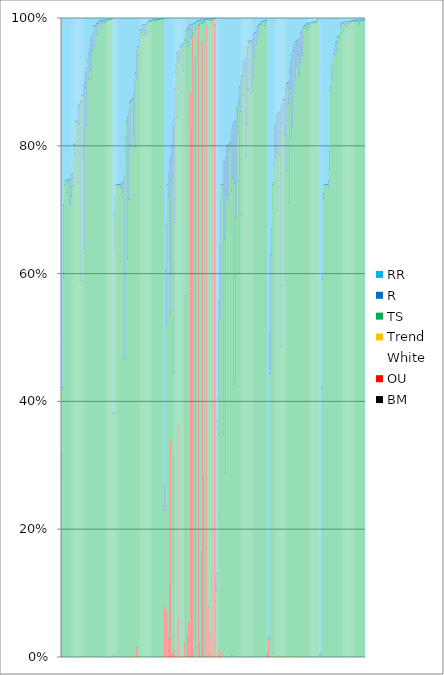
| Category | BM | OU | White | Trend | TS | R | RR |
|---|---|---|---|---|---|---|---|
| 0 | 0 | 0.199 | 0 | 0 | 0.084 | 0.036 | 0.681 |
| 1 | 0 | 0 | 0 | 0 | 0.422 | 0.001 | 0.577 |
| 2 | 0 | 0 | 0 | 0 | 0.594 | 0.114 | 0.291 |
| 3 | 0 | 0 | 0 | 0 | 0.74 | 0 | 0.26 |
| 4 | 0 | 0 | 0 | 0 | 0.744 | 0.002 | 0.254 |
| 5 | 0 | 0 | 0 | 0 | 0.748 | 0 | 0.252 |
| 6 | 0 | 0 | 0 | 0 | 0.727 | 0.021 | 0.252 |
| 7 | 0 | 0 | 0 | 0 | 0.746 | 0.002 | 0.252 |
| 8 | 0 | 0 | 0 | 0 | 0.712 | 0.037 | 0.252 |
| 9 | 0 | 0 | 0 | 0 | 0.709 | 0.041 | 0.25 |
| 10 | 0 | 0 | 0 | 0 | 0.721 | 0.035 | 0.243 |
| 11 | 0 | 0 | 0 | 0 | 0.738 | 0.02 | 0.243 |
| 12 | 0 | 0 | 0 | 0 | 0.803 | 0.001 | 0.196 |
| 13 | 0 | 0 | 0 | 0 | 0.785 | 0.019 | 0.196 |
| 14 | 0 | 0 | 0 | 0 | 0.839 | 0 | 0.161 |
| 15 | 0 | 0 | 0 | 0 | 0.84 | 0 | 0.16 |
| 16 | 0 | 0 | 0 | 0 | 0.744 | 0.12 | 0.136 |
| 17 | 0 | 0 | 0 | 0 | 0.834 | 0.031 | 0.135 |
| 18 | 0 | 0 | 0 | 0 | 0.59 | 0.279 | 0.13 |
| 19 | 0 | 0 | 0 | 0 | 0.87 | 0 | 0.13 |
| 20 | 0 | 0 | 0 | 0 | 0.88 | 0 | 0.12 |
| 21 | 0 | 0 | 0 | 0 | 0.782 | 0.114 | 0.104 |
| 22 | 0 | 0 | 0 | 0 | 0.64 | 0.26 | 0.1 |
| 23 | 0 | 0 | 0 | 0 | 0.891 | 0.025 | 0.084 |
| 24 | 0 | 0.001 | 0 | 0 | 0.832 | 0.089 | 0.078 |
| 25 | 0 | 0 | 0 | 0 | 0.934 | 0 | 0.066 |
| 26 | 0 | 0 | 0 | 0 | 0.905 | 0.041 | 0.054 |
| 27 | 0 | 0 | 0 | 0 | 0.95 | 0.003 | 0.048 |
| 28 | 0 | 0.001 | 0 | 0 | 0.919 | 0.046 | 0.034 |
| 29 | 0 | 0 | 0 | 0 | 0.906 | 0.066 | 0.027 |
| 30 | 0 | 0 | 0 | 0 | 0.949 | 0.028 | 0.023 |
| 31 | 0 | 0 | 0 | 0 | 0.988 | 0 | 0.012 |
| 32 | 0 | 0 | 0 | 0 | 0.957 | 0.032 | 0.011 |
| 33 | 0 | 0 | 0 | 0 | 0.989 | 0 | 0.011 |
| 34 | 0 | 0 | 0 | 0 | 0.975 | 0.018 | 0.008 |
| 35 | 0 | 0 | 0 | 0 | 0.992 | 0.001 | 0.008 |
| 36 | 0 | 0 | 0 | 0 | 0.992 | 0.003 | 0.005 |
| 37 | 0 | 0 | 0 | 0 | 0.996 | 0 | 0.004 |
| 38 | 0 | 0 | 0 | 0 | 0.987 | 0.009 | 0.004 |
| 39 | 0 | 0 | 0 | 0 | 0.996 | 0.001 | 0.003 |
| 40 | 0 | 0 | 0 | 0 | 0.993 | 0.004 | 0.003 |
| 41 | 0 | 0 | 0 | 0 | 0.997 | 0 | 0.003 |
| 42 | 0 | 0 | 0 | 0 | 0.995 | 0.002 | 0.002 |
| 43 | 0 | 0 | 0 | 0 | 0.994 | 0.004 | 0.002 |
| 44 | 0 | 0 | 0 | 0 | 0.997 | 0.001 | 0.002 |
| 45 | 0 | 0 | 0 | 0 | 0.998 | 0 | 0.002 |
| 46 | 0 | 0 | 0 | 0 | 0.999 | 0 | 0.001 |
| 47 | 0 | 0 | 0 | 0 | 0.999 | 0 | 0.001 |
| 48 | 0 | 0 | 0 | 0 | 0.999 | 0 | 0.001 |
| 49 | 0 | 0 | 0 | 0 | 0.999 | 0 | 0.001 |
| 50 | 0 | 0.004 | 0 | 0 | 0.378 | 0 | 0.618 |
| 51 | 0 | 0 | 0 | 0 | 0.693 | 0 | 0.307 |
| 52 | 0 | 0 | 0 | 0 | 0.638 | 0.084 | 0.278 |
| 53 | 0 | 0 | 0 | 0 | 0.74 | 0 | 0.26 |
| 54 | 0 | 0 | 0 | 0 | 0.74 | 0 | 0.26 |
| 55 | 0 | 0 | 0 | 0 | 0.74 | 0 | 0.26 |
| 56 | 0 | 0 | 0 | 0 | 0.74 | 0 | 0.26 |
| 57 | 0 | 0 | 0 | 0 | 0.74 | 0.001 | 0.26 |
| 58 | 0 | 0 | 0 | 0 | 0.735 | 0.008 | 0.257 |
| 59 | 0 | 0 | 0 | 0 | 0.728 | 0.015 | 0.257 |
| 60 | 0 | 0 | 0 | 0 | 0.743 | 0 | 0.257 |
| 61 | 0 | 0.001 | 0 | 0 | 0.467 | 0.285 | 0.247 |
| 62 | 0 | 0 | 0 | 0 | 0.791 | 0.024 | 0.185 |
| 63 | 0 | 0 | 0 | 0 | 0.837 | 0.001 | 0.161 |
| 64 | 0 | 0 | 0 | 0 | 0.625 | 0.222 | 0.153 |
| 65 | 0 | 0 | 0 | 0 | 0.716 | 0.138 | 0.145 |
| 66 | 0 | 0 | 0 | 0 | 0.867 | 0.003 | 0.13 |
| 67 | 0 | 0 | 0 | 0 | 0.802 | 0.07 | 0.127 |
| 68 | 0 | 0 | 0 | 0 | 0.87 | 0.003 | 0.127 |
| 69 | 0 | 0 | 0 | 0 | 0.873 | 0.002 | 0.125 |
| 70 | 0 | 0 | 0 | 0 | 0.819 | 0.063 | 0.118 |
| 71 | 0 | 0.002 | 0 | 0 | 0.797 | 0.102 | 0.099 |
| 72 | 0 | 0 | 0 | 0 | 0.915 | 0.001 | 0.084 |
| 73 | 0 | 0.016 | 0 | 0 | 0.891 | 0.043 | 0.05 |
| 74 | 0 | 0 | 0 | 0 | 0.956 | 0 | 0.044 |
| 75 | 0 | 0 | 0 | 0 | 0.956 | 0 | 0.044 |
| 76 | 0 | 0 | 0 | 0 | 0.966 | 0.017 | 0.018 |
| 77 | 0 | 0 | 0 | 0 | 0.983 | 0 | 0.017 |
| 78 | 0 | 0 | 0 | 0 | 0.978 | 0.01 | 0.012 |
| 79 | 0 | 0 | 0 | 0 | 0.974 | 0.016 | 0.01 |
| 80 | 0 | 0 | 0 | 0 | 0.981 | 0.01 | 0.01 |
| 81 | 0 | 0 | 0 | 0 | 0.975 | 0.016 | 0.009 |
| 82 | 0 | 0 | 0 | 0 | 0.976 | 0.014 | 0.009 |
| 83 | 0 | 0 | 0 | 0 | 0.993 | 0 | 0.007 |
| 84 | 0 | 0 | 0 | 0 | 0.993 | 0.002 | 0.004 |
| 85 | 0 | 0 | 0 | 0 | 0.996 | 0 | 0.004 |
| 86 | 0 | 0 | 0 | 0 | 0.997 | 0 | 0.003 |
| 87 | 0 | 0 | 0 | 0 | 0.996 | 0.001 | 0.003 |
| 88 | 0 | 0 | 0 | 0 | 0.998 | 0 | 0.002 |
| 89 | 0 | 0 | 0 | 0 | 0.998 | 0 | 0.002 |
| 90 | 0 | 0 | 0 | 0 | 0.996 | 0.002 | 0.001 |
| 91 | 0 | 0 | 0 | 0 | 0.996 | 0.002 | 0.001 |
| 92 | 0 | 0 | 0 | 0 | 0.999 | 0 | 0.001 |
| 93 | 0 | 0 | 0 | 0 | 0.998 | 0.001 | 0.001 |
| 94 | 0 | 0 | 0 | 0 | 0.999 | 0 | 0.001 |
| 95 | 0 | 0 | 0 | 0 | 0.998 | 0.001 | 0.001 |
| 96 | 0 | 0 | 0 | 0 | 1 | 0 | 0 |
| 97 | 0 | 0 | 0 | 0 | 1 | 0 | 0 |
| 98 | 0 | 0 | 0 | 0 | 1 | 0 | 0 |
| 99 | 0 | 0 | 0 | 0 | 1 | 0 | 0 |
| 100 | 0 | 0.08 | 0 | 0 | 0.151 | 0.038 | 0.732 |
| 101 | 0 | 0 | 0 | 0 | 0.605 | 0 | 0.395 |
| 102 | 0 | 0.072 | 0 | 0 | 0.449 | 0.157 | 0.322 |
| 103 | 0 | 0 | 0 | 0 | 0.74 | 0 | 0.26 |
| 104 | 0 | 0.03 | 0 | 0 | 0.692 | 0.033 | 0.246 |
| 105 | 0 | 0.113 | 0 | 0 | 0.508 | 0.157 | 0.222 |
| 106 | 0 | 0.34 | 0 | 0 | 0.201 | 0.244 | 0.215 |
| 107 | 0 | 0.005 | 0 | 0 | 0.595 | 0.198 | 0.202 |
| 108 | 0 | 0.004 | 0 | 0 | 0.748 | 0.078 | 0.17 |
| 109 | 0 | 0.316 | 0 | 0 | 0.129 | 0.396 | 0.158 |
| 110 | 0 | 0.012 | 0 | 0 | 0.669 | 0.209 | 0.11 |
| 111 | 0 | 0.003 | 0 | 0 | 0.912 | 0.013 | 0.071 |
| 112 | 0 | 0.002 | 0 | 0 | 0.935 | 0.009 | 0.054 |
| 113 | 0 | 0.364 | 0 | 0 | 0.482 | 0.102 | 0.053 |
| 114 | 0 | 0.06 | 0 | 0 | 0.873 | 0.018 | 0.049 |
| 115 | 0 | 0 | 0 | 0 | 0.955 | 0 | 0.045 |
| 116 | 0 | 0.001 | 0 | 0 | 0.883 | 0.075 | 0.041 |
| 117 | 0 | 0 | 0 | 0 | 0.959 | 0.001 | 0.04 |
| 118 | 0 | 0.001 | 0 | 0 | 0.917 | 0.044 | 0.038 |
| 119 | 0 | 0.021 | 0 | 0 | 0.945 | 0.001 | 0.033 |
| 120 | 0 | 0.566 | 0 | 0 | 0.39 | 0.024 | 0.02 |
| 121 | 0 | 0 | 0 | 0 | 0.984 | 0 | 0.016 |
| 122 | 0 | 0.031 | 0 | 0 | 0.931 | 0.024 | 0.015 |
| 123 | 0 | 0.054 | 0 | 0 | 0.902 | 0.032 | 0.012 |
| 124 | 0 | 0.005 | 0 | 0 | 0.977 | 0.007 | 0.011 |
| 125 | 0 | 0.884 | 0 | 0 | 0.09 | 0.017 | 0.009 |
| 126 | 0 | 0.826 | 0 | 0 | 0.143 | 0.022 | 0.009 |
| 127 | 0 | 0.974 | 0 | 0 | 0.003 | 0.015 | 0.008 |
| 128 | 0 | 0.008 | 0 | 0 | 0.983 | 0 | 0.008 |
| 129 | 0 | 0 | 0 | 0 | 0.993 | 0 | 0.007 |
| 130 | 0 | 0.94 | 0 | 0 | 0.043 | 0.011 | 0.006 |
| 131 | 0 | 0 | 0 | 0 | 0.994 | 0 | 0.006 |
| 132 | 0 | 0 | 0 | 0 | 0.997 | 0 | 0.003 |
| 133 | 0 | 0.988 | 0 | 0 | 0.002 | 0.006 | 0.003 |
| 134 | 0 | 0.021 | 0 | 0 | 0.968 | 0.008 | 0.003 |
| 135 | 0 | 0 | 0 | 0 | 0.998 | 0 | 0.002 |
| 136 | 0 | 0.166 | 0 | 0 | 0.827 | 0.005 | 0.002 |
| 137 | 0 | 0.962 | 0 | 0 | 0.032 | 0.005 | 0.002 |
| 138 | 0 | 0.283 | 0 | 0 | 0.712 | 0.003 | 0.002 |
| 139 | 0 | 0 | 0 | 0 | 0.995 | 0.003 | 0.002 |
| 140 | 0 | 0 | 0 | 0 | 0.998 | 0 | 0.001 |
| 141 | 0 | 0.988 | 0 | 0 | 0.01 | 0.001 | 0.001 |
| 142 | 0 | 0 | 0 | 0 | 0.999 | 0 | 0.001 |
| 143 | 0 | 0.079 | 0 | 0 | 0.918 | 0.002 | 0.001 |
| 144 | 0 | 0.005 | 0 | 0 | 0.993 | 0.001 | 0.001 |
| 145 | 0 | 0.037 | 0 | 0 | 0.961 | 0.001 | 0.001 |
| 146 | 0 | 0.997 | 0 | 0 | 0 | 0.002 | 0.001 |
| 147 | 0 | 0 | 0 | 0 | 0.999 | 0 | 0 |
| 148 | 0 | 1 | 0 | 0 | 0 | 0 | 0 |
| 149 | 0 | 0.99 | 0 | 0 | 0.01 | 0 | 0 |
| 150 | 0 | 0 | 0 | 0 | 0.104 | 0.029 | 0.867 |
| 151 | 0 | 0 | 0 | 0 | 0.358 | 0.013 | 0.629 |
| 152 | 0 | 0.01 | 0 | 0 | 0.396 | 0.151 | 0.443 |
| 153 | 0 | 0 | 0 | 0 | 0.219 | 0.423 | 0.358 |
| 154 | 0 | 0.008 | 0 | 0 | 0.526 | 0.183 | 0.283 |
| 155 | 0 | 0 | 0 | 0 | 0.74 | 0 | 0.26 |
| 156 | 0 | 0 | 0 | 0 | 0.74 | 0 | 0.26 |
| 157 | 0 | 0.002 | 0 | 0 | 0.347 | 0.427 | 0.224 |
| 158 | 0 | 0 | 0 | 0 | 0.655 | 0.121 | 0.224 |
| 159 | 0 | 0 | 0 | 0 | 0.289 | 0.495 | 0.215 |
| 160 | 0 | 0.001 | 0 | 0 | 0.723 | 0.077 | 0.2 |
| 161 | 0 | 0 | 0 | 0 | 0.718 | 0.084 | 0.198 |
| 162 | 0 | 0 | 0 | 0 | 0.708 | 0.094 | 0.198 |
| 163 | 0 | 0 | 0 | 0 | 0.795 | 0.01 | 0.195 |
| 164 | 0 | 0 | 0 | 0 | 0.806 | 0 | 0.194 |
| 165 | 0 | 0.004 | 0 | 0 | 0.726 | 0.094 | 0.176 |
| 166 | 0 | 0 | 0 | 0 | 0.75 | 0.082 | 0.168 |
| 167 | 0 | 0.003 | 0 | 0 | 0.425 | 0.41 | 0.163 |
| 168 | 0 | 0 | 0 | 0 | 0.742 | 0.096 | 0.162 |
| 169 | 0 | 0.002 | 0 | 0 | 0.431 | 0.406 | 0.161 |
| 170 | 0 | 0 | 0 | 0 | 0.69 | 0.171 | 0.139 |
| 171 | 0 | 0 | 0 | 0 | 0.82 | 0.042 | 0.138 |
| 172 | 0 | 0 | 0 | 0 | 0.866 | 0.007 | 0.127 |
| 173 | 0 | 0 | 0 | 0 | 0.601 | 0.292 | 0.106 |
| 174 | 0 | 0 | 0 | 0 | 0.855 | 0.044 | 0.101 |
| 175 | 0 | 0 | 0 | 0 | 0.692 | 0.218 | 0.089 |
| 176 | 0 | 0 | 0 | 0 | 0.91 | 0.017 | 0.074 |
| 177 | 0 | 0 | 0 | 0 | 0.88 | 0.052 | 0.068 |
| 178 | 0 | 0 | 0 | 0 | 0.922 | 0.013 | 0.065 |
| 179 | 0 | 0 | 0 | 0 | 0.784 | 0.154 | 0.062 |
| 180 | 0 | 0 | 0 | 0 | 0.836 | 0.118 | 0.046 |
| 181 | 0 | 0 | 0 | 0 | 0.887 | 0.077 | 0.036 |
| 182 | 0 | 0 | 0 | 0 | 0.962 | 0.003 | 0.035 |
| 183 | 0 | 0 | 0 | 0 | 0.965 | 0 | 0.035 |
| 184 | 0 | 0 | 0 | 0 | 0.882 | 0.083 | 0.034 |
| 185 | 0 | 0 | 0 | 0 | 0.896 | 0.07 | 0.033 |
| 186 | 0 | 0 | 0 | 0 | 0.909 | 0.067 | 0.025 |
| 187 | 0 | 0 | 0 | 0 | 0.941 | 0.036 | 0.022 |
| 188 | 0 | 0 | 0 | 0 | 0.978 | 0 | 0.022 |
| 189 | 0 | 0 | 0 | 0 | 0.961 | 0.021 | 0.018 |
| 190 | 0 | 0 | 0 | 0 | 0.987 | 0.002 | 0.011 |
| 191 | 0 | 0 | 0 | 0 | 0.975 | 0.014 | 0.01 |
| 192 | 0 | 0 | 0 | 0 | 0.99 | 0 | 0.01 |
| 193 | 0 | 0 | 0 | 0 | 0.993 | 0 | 0.007 |
| 194 | 0 | 0 | 0 | 0 | 0.99 | 0.005 | 0.005 |
| 195 | 0 | 0 | 0 | 0 | 0.996 | 0 | 0.004 |
| 196 | 0 | 0 | 0 | 0 | 0.995 | 0.001 | 0.004 |
| 197 | 0 | 0 | 0 | 0 | 0.989 | 0.008 | 0.003 |
| 198 | 0 | 0 | 0 | 0 | 0.995 | 0.002 | 0.003 |
| 199 | 0 | 0 | 0 | 0 | 0.998 | 0 | 0.002 |
| 200 | 0 | 0.006 | 0 | 0 | 0 | 0 | 0.994 |
| 201 | 0 | 0.03 | 0 | 0 | 0 | 0 | 0.969 |
| 202 | 0 | 0 | 0 | 0 | 0.452 | 0.055 | 0.492 |
| 203 | 0 | 0 | 0 | 0 | 0.444 | 0.187 | 0.369 |
| 204 | 0 | 0 | 0 | 0 | 0.631 | 0.04 | 0.328 |
| 205 | 0 | 0 | 0 | 0 | 0.74 | 0 | 0.26 |
| 206 | 0 | 0 | 0 | 0 | 0.743 | 0 | 0.257 |
| 207 | 0 | 0 | 0 | 0 | 0.771 | 0.059 | 0.17 |
| 208 | 0 | 0 | 0 | 0 | 0.784 | 0.052 | 0.165 |
| 209 | 0 | 0 | 0 | 0 | 0.791 | 0.057 | 0.152 |
| 210 | 0 | 0.003 | 0 | 0 | 0.696 | 0.152 | 0.149 |
| 211 | 0 | 0 | 0 | 0 | 0.786 | 0.067 | 0.147 |
| 212 | 0 | 0 | 0 | 0 | 0.821 | 0.032 | 0.146 |
| 213 | 0 | 0 | 0 | 0 | 0.487 | 0.374 | 0.139 |
| 214 | 0 | 0 | 0 | 0 | 0.836 | 0.027 | 0.137 |
| 215 | 0 | 0 | 0 | 0 | 0.873 | 0 | 0.127 |
| 216 | 0 | 0.001 | 0 | 0 | 0.817 | 0.056 | 0.126 |
| 217 | 0 | 0 | 0 | 0 | 0.59 | 0.3 | 0.11 |
| 218 | 0 | 0 | 0 | 0 | 0.762 | 0.136 | 0.101 |
| 219 | 0 | 0 | 0 | 0 | 0.898 | 0.002 | 0.1 |
| 220 | 0 | 0.002 | 0 | 0 | 0.865 | 0.034 | 0.1 |
| 221 | 0 | 0 | 0 | 0 | 0.712 | 0.206 | 0.081 |
| 222 | 0 | 0 | 0 | 0 | 0.89 | 0.042 | 0.068 |
| 223 | 0 | 0 | 0 | 0 | 0.815 | 0.128 | 0.057 |
| 224 | 0 | 0 | 0 | 0 | 0.832 | 0.118 | 0.05 |
| 225 | 0 | 0 | 0 | 0 | 0.95 | 0.005 | 0.045 |
| 226 | 0 | 0.001 | 0 | 0 | 0.882 | 0.077 | 0.04 |
| 227 | 0 | 0 | 0 | 0 | 0.91 | 0.054 | 0.036 |
| 228 | 0 | 0 | 0 | 0 | 0.927 | 0.039 | 0.035 |
| 229 | 0 | 0 | 0 | 0 | 0.943 | 0.023 | 0.034 |
| 230 | 0 | 0 | 0 | 0 | 0.914 | 0.053 | 0.033 |
| 231 | 0 | 0 | 0 | 0 | 0.911 | 0.057 | 0.032 |
| 232 | 0 | 0 | 0 | 0 | 0.931 | 0.048 | 0.021 |
| 233 | 0 | 0 | 0 | 0 | 0.947 | 0.031 | 0.021 |
| 234 | 0 | 0 | 0 | 0 | 0.942 | 0.041 | 0.017 |
| 235 | 0 | 0 | 0 | 0 | 0.987 | 0 | 0.013 |
| 236 | 0 | 0 | 0 | 0 | 0.988 | 0.001 | 0.011 |
| 237 | 0 | 0 | 0 | 0 | 0.99 | 0 | 0.01 |
| 238 | 0 | 0 | 0 | 0 | 0.986 | 0.006 | 0.008 |
| 239 | 0 | 0 | 0 | 0 | 0.982 | 0.011 | 0.007 |
| 240 | 0 | 0 | 0 | 0 | 0.991 | 0.002 | 0.007 |
| 241 | 0 | 0 | 0 | 0 | 0.987 | 0.006 | 0.007 |
| 242 | 0 | 0 | 0 | 0 | 0.992 | 0.001 | 0.007 |
| 243 | 0 | 0 | 0 | 0 | 0.994 | 0 | 0.006 |
| 244 | 0 | 0 | 0 | 0 | 0.994 | 0 | 0.006 |
| 245 | 0 | 0 | 0 | 0 | 0.994 | 0.001 | 0.005 |
| 246 | 0 | 0 | 0 | 0 | 0.995 | 0 | 0.005 |
| 247 | 0 | 0 | 0 | 0 | 0.993 | 0.003 | 0.004 |
| 248 | 0 | 0 | 0 | 0 | 0.997 | 0.001 | 0.002 |
| 249 | 0 | 0 | 0 | 0 | 0.999 | 0 | 0.001 |
| 250 | 0 | 0 | 0 | 0 | 0.003 | 0 | 0.997 |
| 251 | 0 | 0 | 0 | 0 | 0.004 | 0 | 0.995 |
| 252 | 0 | 0 | 0 | 0 | 0.42 | 0.004 | 0.577 |
| 253 | 0 | 0.001 | 0 | 0 | 0.59 | 0.006 | 0.403 |
| 254 | 0 | 0 | 0 | 0 | 0.718 | 0.008 | 0.274 |
| 255 | 0 | 0 | 0 | 0 | 0.74 | 0 | 0.26 |
| 256 | 0 | 0 | 0 | 0 | 0.74 | 0 | 0.26 |
| 257 | 0 | 0 | 0 | 0 | 0.74 | 0 | 0.26 |
| 258 | 0 | 0 | 0 | 0 | 0.74 | 0 | 0.26 |
| 259 | 0 | 0 | 0 | 0 | 0.734 | 0.013 | 0.253 |
| 260 | 0 | 0 | 0 | 0 | 0.764 | 0.028 | 0.208 |
| 261 | 0 | 0 | 0 | 0 | 0.887 | 0.006 | 0.106 |
| 262 | 0 | 0 | 0 | 0 | 0.907 | 0.013 | 0.079 |
| 263 | 0 | 0 | 0 | 0 | 0.926 | 0.004 | 0.07 |
| 264 | 0 | 0 | 0 | 0 | 0.945 | 0 | 0.055 |
| 265 | 0 | 0 | 0 | 0 | 0.944 | 0.008 | 0.048 |
| 266 | 0 | 0 | 0 | 0 | 0.958 | 0.005 | 0.037 |
| 267 | 0 | 0 | 0 | 0 | 0.949 | 0.015 | 0.035 |
| 268 | 0 | 0 | 0 | 0 | 0.962 | 0.01 | 0.028 |
| 269 | 0 | 0 | 0 | 0 | 0.972 | 0 | 0.028 |
| 270 | 0 | 0 | 0 | 0 | 0.969 | 0.004 | 0.026 |
| 271 | 0 | 0 | 0 | 0 | 0.987 | 0.004 | 0.009 |
| 272 | 0 | 0 | 0 | 0 | 0.977 | 0.016 | 0.007 |
| 273 | 0 | 0 | 0 | 0 | 0.993 | 0.001 | 0.007 |
| 274 | 0 | 0 | 0 | 0 | 0.98 | 0.014 | 0.006 |
| 275 | 0 | 0 | 0 | 0 | 0.991 | 0.004 | 0.005 |
| 276 | 0 | 0 | 0 | 0 | 0.987 | 0.009 | 0.004 |
| 277 | 0 | 0 | 0 | 0 | 0.993 | 0.002 | 0.004 |
| 278 | 0 | 0 | 0 | 0 | 0.988 | 0.008 | 0.004 |
| 279 | 0 | 0 | 0 | 0 | 0.992 | 0.004 | 0.004 |
| 280 | 0 | 0 | 0 | 0 | 0.995 | 0.001 | 0.004 |
| 281 | 0 | 0 | 0 | 0 | 0.995 | 0.002 | 0.003 |
| 282 | 0 | 0 | 0 | 0 | 0.997 | 0 | 0.003 |
| 283 | 0 | 0 | 0 | 0 | 0.997 | 0 | 0.003 |
| 284 | 0 | 0 | 0 | 0 | 0.996 | 0.001 | 0.003 |
| 285 | 0 | 0 | 0 | 0 | 0.996 | 0.002 | 0.003 |
| 286 | 0 | 0 | 0 | 0 | 0.997 | 0 | 0.003 |
| 287 | 0 | 0 | 0 | 0 | 0.996 | 0.001 | 0.003 |
| 288 | 0 | 0 | 0 | 0 | 0.991 | 0.007 | 0.003 |
| 289 | 0 | 0 | 0 | 0 | 0.994 | 0.004 | 0.002 |
| 290 | 0 | 0 | 0 | 0 | 0.997 | 0.001 | 0.002 |
| 291 | 0 | 0 | 0 | 0 | 0.996 | 0.002 | 0.002 |
| 292 | 0 | 0 | 0 | 0 | 0.998 | 0 | 0.002 |
| 293 | 0 | 0 | 0 | 0 | 0.998 | 0 | 0.002 |
| 294 | 0 | 0 | 0 | 0 | 0.997 | 0.002 | 0.002 |